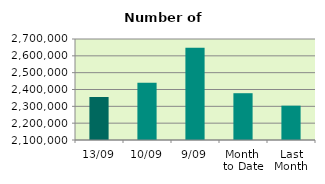
| Category | Series 0 |
|---|---|
| 13/09 | 2355394 |
| 10/09 | 2440256 |
| 9/09 | 2648724 |
| Month 
to Date | 2377988.889 |
| Last
Month | 2303894.727 |